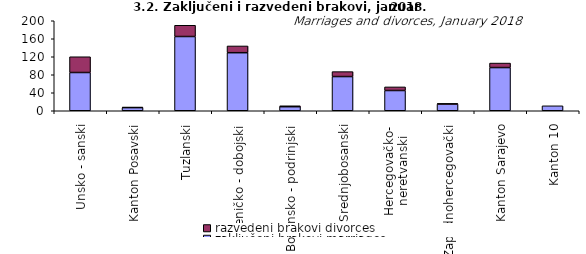
| Category | zaključeni brakovi marriages | razvedeni brakovi divorces |
|---|---|---|
| Unsko - sanski | 85 | 35 |
| Kanton Posavski | 7 | 1 |
| Tuzlanski | 165 | 25 |
| Zeničko - dobojski | 129 | 15 |
| Bosansko - podrinjski | 9 | 2 |
| Srednjobosanski | 76 | 11 |
| Hercegovačko-
neretvanski | 45 | 8 |
| Zapadnohercegovački | 15 | 1 |
| Kanton Sarajevo | 96 | 10 |
| Kanton 10 | 11 | 0 |